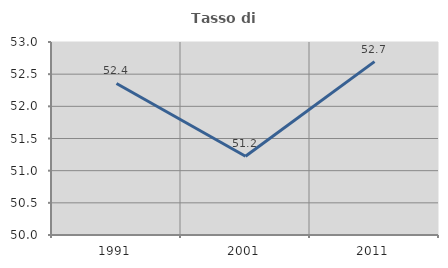
| Category | Tasso di occupazione   |
|---|---|
| 1991.0 | 52.356 |
| 2001.0 | 51.223 |
| 2011.0 | 52.695 |